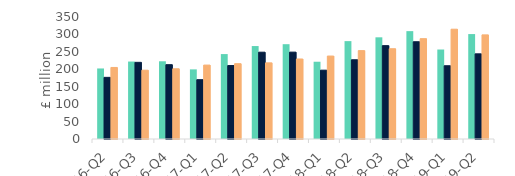
| Category | First-time
buyers | Homemovers | Homowner remortgaging |
|---|---|---|---|
| 16-Q2 | 202.359 | 176.844 | 205.227 |
| 16-Q3 | 222.2 | 219.936 | 197.365 |
| 16-Q4 | 222.961 | 213.2 | 201.437 |
| 17-Q1 | 199.735 | 170.135 | 212.055 |
| 17-Q2 | 243.635 | 210.732 | 216.041 |
| 17-Q3 | 266.658 | 249.025 | 218.433 |
| 17-Q4 | 271.999 | 249.195 | 229.522 |
| 18-Q1 | 221.674 | 197.446 | 237.963 |
| 18-Q2 | 280.809 | 227.332 | 253.542 |
| 18-Q3 | 291.717 | 267.803 | 258.97 |
| 18-Q4 | 309.463 | 279.02 | 287.811 |
| 19-Q1 | 256.723 | 210.169 | 314.969 |
| 19-Q2 | 301.034 | 244.31 | 298.676 |